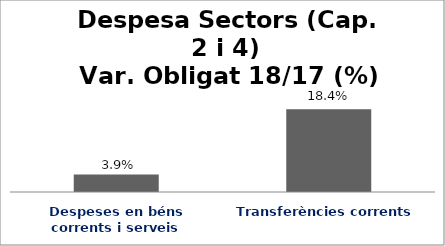
| Category | Series 0 |
|---|---|
| Despeses en béns corrents i serveis | 0.039 |
| Transferències corrents | 0.184 |